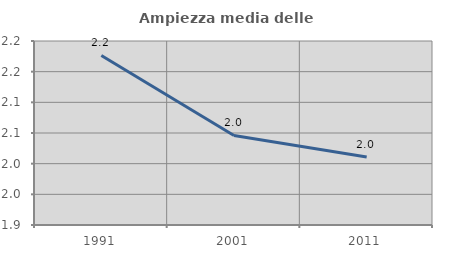
| Category | Ampiezza media delle famiglie |
|---|---|
| 1991.0 | 2.176 |
| 2001.0 | 2.046 |
| 2011.0 | 2.011 |